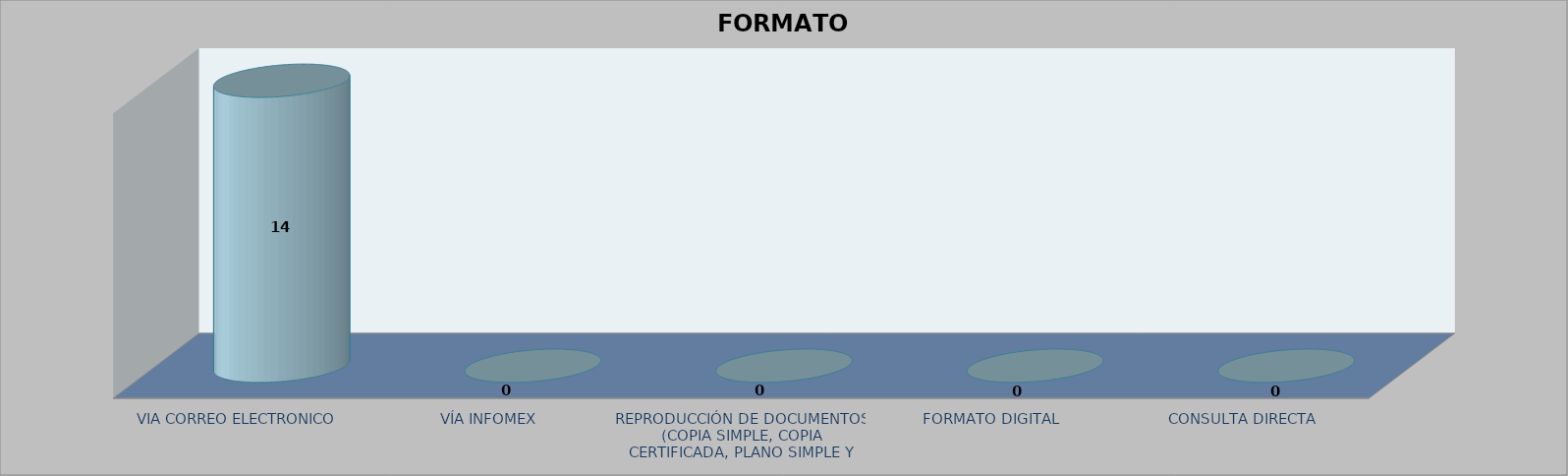
| Category |        FORMATO SOLICITADO | Series 1 | Series 2 |
|---|---|---|---|
| VIA CORREO ELECTRONICO |  |  | 14 |
| VÍA INFOMEX |  |  | 0 |
| REPRODUCCIÓN DE DOCUMENTOS (COPIA SIMPLE, COPIA CERTIFICADA, PLANO SIMPLE Y PLANO CERTIFICADO) |  |  | 0 |
| FORMATO DIGITAL |  |  | 0 |
| CONSULTA DIRECTA |  |  | 0 |